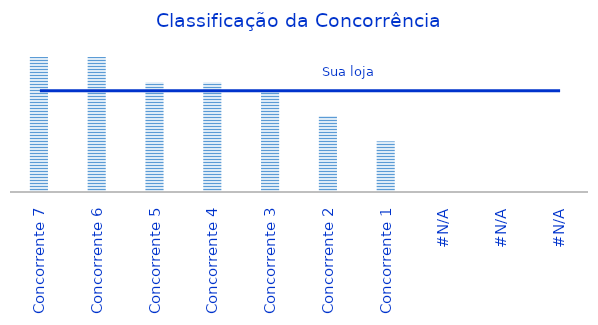
| Category | Series 0 |
|---|---|
| Concorrente 7 | 16 |
| Concorrente 6 | 16 |
| Concorrente 5 | 13 |
| Concorrente 4 | 13 |
| Concorrente 3 | 12 |
| Concorrente 2 | 9 |
| Concorrente 1 | 6 |
| #N/D | 0 |
| #N/D | 0 |
| #N/D | 0 |